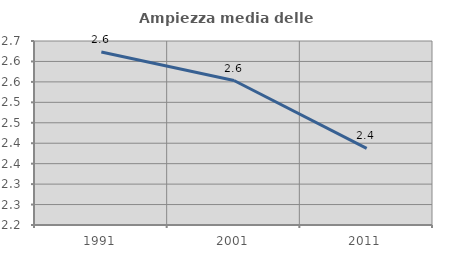
| Category | Ampiezza media delle famiglie |
|---|---|
| 1991.0 | 2.623 |
| 2001.0 | 2.553 |
| 2011.0 | 2.387 |